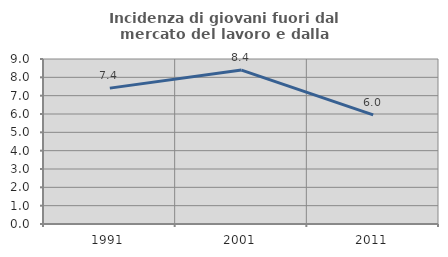
| Category | Incidenza di giovani fuori dal mercato del lavoro e dalla formazione  |
|---|---|
| 1991.0 | 7.412 |
| 2001.0 | 8.396 |
| 2011.0 | 5.95 |